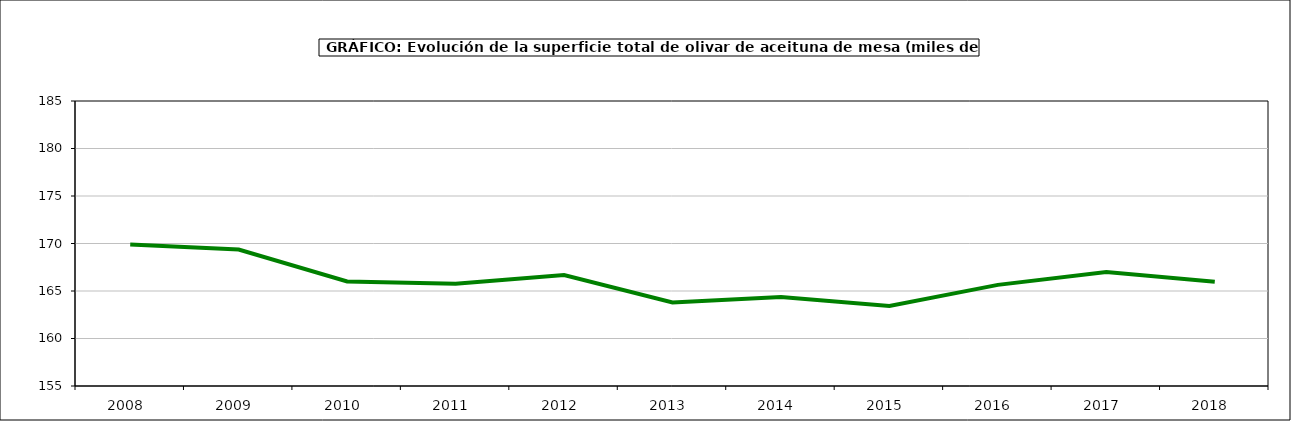
| Category | superficie |
|---|---|
| 2008.0 | 169.892 |
| 2009.0 | 169.372 |
| 2010.0 | 166.006 |
| 2011.0 | 165.762 |
| 2012.0 | 166.679 |
| 2013.0 | 163.795 |
| 2014.0 | 164.379 |
| 2015.0 | 163.414 |
| 2016.0 | 165.647 |
| 2017.0 | 166.997 |
| 2018.0 | 165.98 |